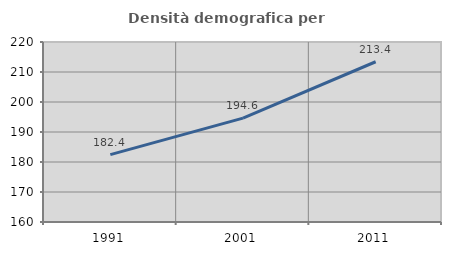
| Category | Densità demografica |
|---|---|
| 1991.0 | 182.447 |
| 2001.0 | 194.621 |
| 2011.0 | 213.416 |